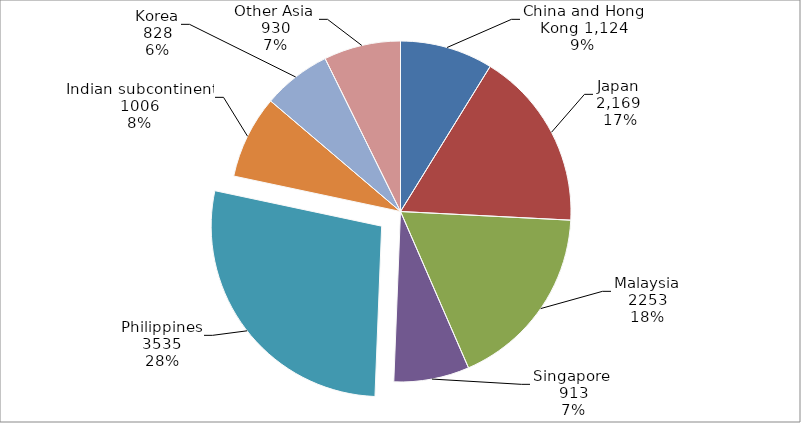
| Category | Column1 |
|---|---|
| China and Hong Kong | 1124 |
| Japan | 2169 |
| Malaysia | 2253 |
| Singapore | 913 |
| Philippines | 3535 |
| Indian subcontinent | 1006 |
| Korea | 828 |
| Other Asia | 930 |